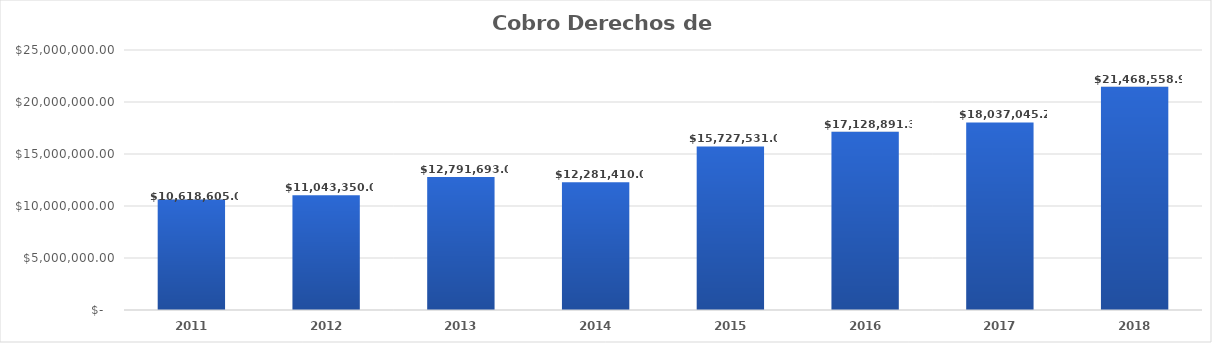
| Category | Cobro Derechos de Agua |
|---|---|
| 2011.0 | 10618605 |
| 2012.0 | 11043350 |
| 2013.0 | 12791693 |
| 2014.0 | 12281410 |
| 2015.0 | 15727531 |
| 2016.0 | 17128891.31 |
| 2017.0 | 18037045.24 |
| 2018.0 | 21468558.97 |